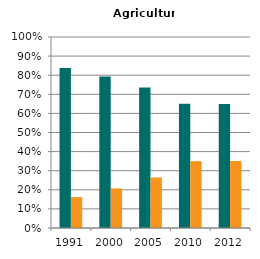
| Category | Male | Female |
|---|---|---|
| 1991.0 | 0.838 | 0.162 |
| 2000.0 | 0.793 | 0.207 |
| 2005.0 | 0.735 | 0.265 |
| 2010.0 | 0.65 | 0.35 |
| 2012.0 | 0.649 | 0.351 |